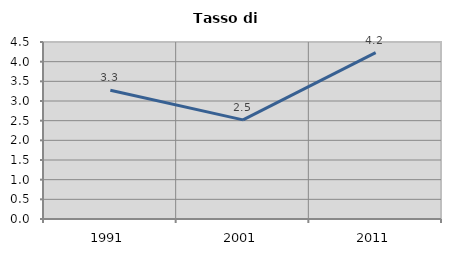
| Category | Tasso di disoccupazione   |
|---|---|
| 1991.0 | 3.273 |
| 2001.0 | 2.521 |
| 2011.0 | 4.23 |